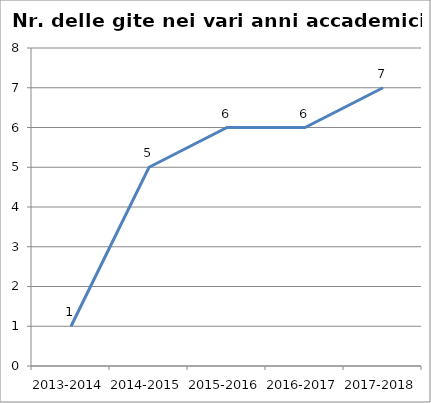
| Category | Nr. Gite Svolte |
|---|---|
| 2013-2014 | 1 |
| 2014-2015 | 5 |
| 2015-2016 | 6 |
| 2016-2017 | 6 |
| 2017-2018 | 7 |